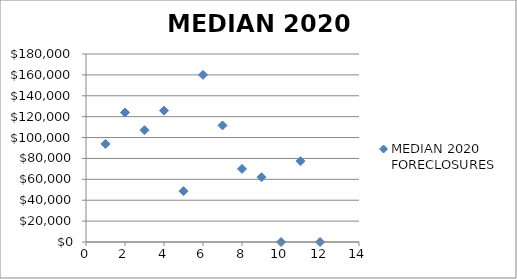
| Category | MEDIAN 2020 FORECLOSURES |
|---|---|
| 1.0 | 93925 |
| 2.0 | 124000 |
| 3.0 | 107000 |
| 4.0 | 125751.5 |
| 5.0 | 48663.5 |
| 6.0 | 160000 |
| 7.0 | 111589 |
| 8.0 | 70000 |
| 9.0 | 62000 |
| 10.0 | 0 |
| 11.0 | 77412 |
| 12.0 | 0 |